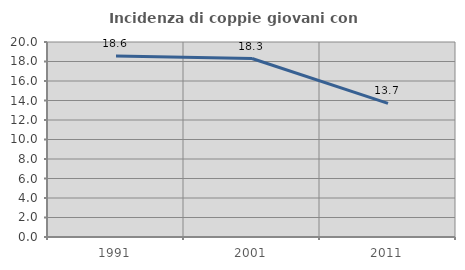
| Category | Incidenza di coppie giovani con figli |
|---|---|
| 1991.0 | 18.568 |
| 2001.0 | 18.307 |
| 2011.0 | 13.706 |